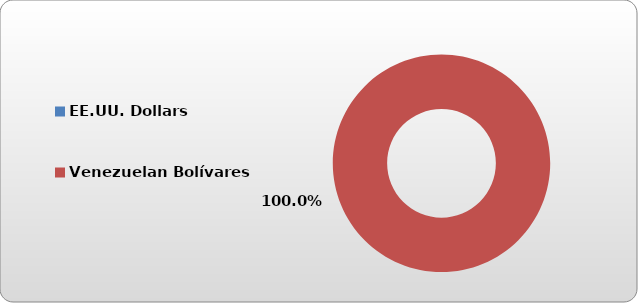
| Category | EE.UU. Dollars |
|---|---|
| EE.UU. Dollars | 0 |
| Venezuelan Bolívares | 435756.2 |